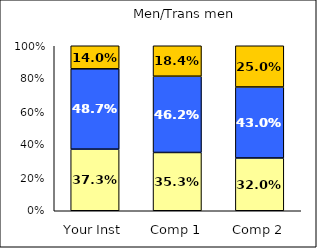
| Category | Low Science Self-Efficacy | Average Science Self-Efficacy | High Science Self-Efficacy |
|---|---|---|---|
| Your Inst | 0.373 | 0.487 | 0.14 |
| Comp 1 | 0.353 | 0.462 | 0.184 |
| Comp 2 | 0.32 | 0.43 | 0.25 |